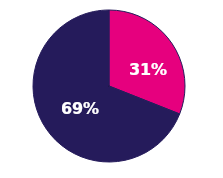
| Category | Series 0 |
|---|---|
| Male | 0.31 |
| Female | 0.69 |